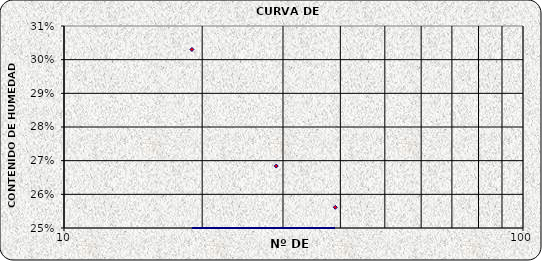
| Category | Series 0 |
|---|---|
| 39.0 | 0.256 |
| 29.0 | 0.268 |
| 19.0 | 0.303 |